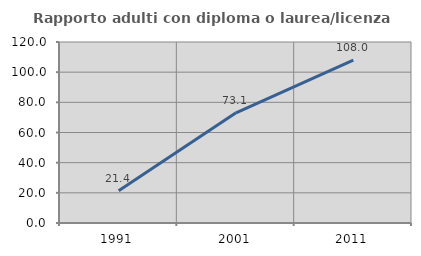
| Category | Rapporto adulti con diploma o laurea/licenza media  |
|---|---|
| 1991.0 | 21.443 |
| 2001.0 | 73.059 |
| 2011.0 | 108.034 |